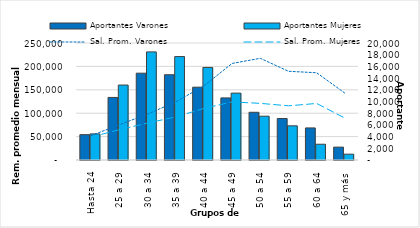
| Category | Aportantes Varones | Aportantes Mujeres |
|---|---|---|
| Hasta 24 | 4331 | 4464 |
| 25 a 29 | 10693 | 12814 |
| 30 a 34 | 14841 | 18482 |
| 35 a 39 | 14577 | 17681 |
| 40 a 44 | 12447 | 15822 |
| 45 a 49 | 10612 | 11434 |
| 50 a 54 | 8155 | 7488 |
| 55 a 59 | 7096 | 5844 |
| 60 a 64 | 5481 | 2693 |
| 65 y más | 2201 | 995 |